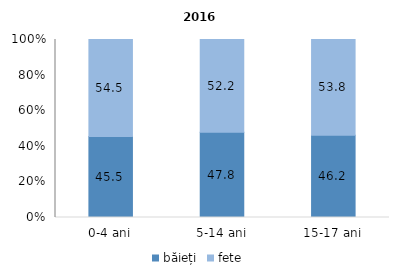
| Category | băieți | fete |
|---|---|---|
| 0-4 ani | 45.455 | 54.545 |
| 5-14 ani | 47.826 | 52.174 |
| 15-17 ani | 46.154 | 53.846 |